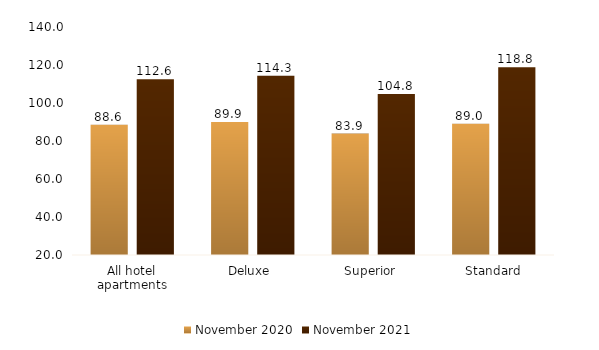
| Category | November 2020 | November 2021 |
|---|---|---|
| All hotel apartments | 88.569 | 112.56 |
| Deluxe  | 89.935 | 114.306 |
| Superior  | 83.907 | 104.762 |
| Standard | 89.018 | 118.754 |